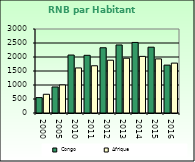
| Category | Congo | Afrique                        |
|---|---|---|
| 2000.0 | 550 | 668.557 |
| 2005.0 | 930 | 1002.896 |
| 2010.0 | 2070 | 1608.999 |
| 2011.0 | 2060 | 1686.521 |
| 2012.0 | 2330 | 1885.129 |
| 2013.0 | 2430 | 1956.671 |
| 2014.0 | 2520 | 2022.289 |
| 2015.0 | 2350 | 1932.283 |
| 2016.0 | 1710 | 1781.415 |